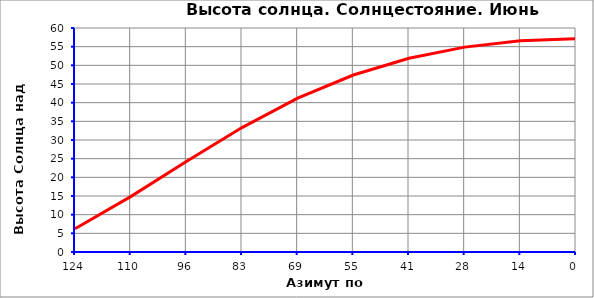
| Category | Series 1 |
|---|---|
| 123.93089971692598 | 6.213 |
| 110.16079974837865 | 14.832 |
| 96.39069977983132 | 24.228 |
| 82.620599811284 | 33.335 |
| 68.85049984273667 | 41.215 |
| 55.08039987418934 | 47.408 |
| 41.31029990564201 | 51.897 |
| 27.54019993709468 | 54.88 |
| 13.770099968547349 | 56.572 |
| 1.7763568394002505e-14 | 57.12 |